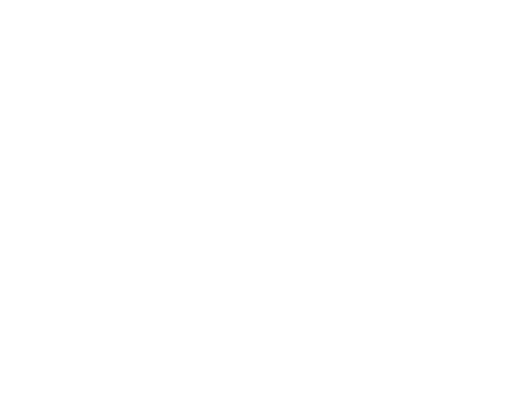
| Category | Series 0 | Series 1 | Series 2 |
|---|---|---|---|
| Impuestos | 21999402 | 0.127 |  |
| Cuotas y Aportaciones de Seguridad Social | 0 | 0 |  |
| Contribuciones de Mejoras | 0 | 0 |  |
| Derechos | 11400179 | 0.066 |  |
| Productos | 36458 | 0 |  |
| Aprovechamientos | 928919 | 0.005 |  |
| Ingresos por Ventas de Bienes y Servicios | 0 | 0 |  |
| Participaciones y Aportaciones | 139033324 | 0.802 |  |
| Transferencias, Asignaciones, Subsidios y Otras Ayudas | 0 | 0 |  |
| Ingresos Derivados de Financiamientos | 0 | 0 |  |